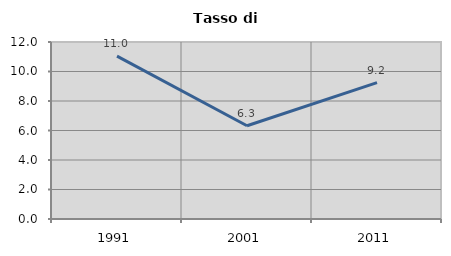
| Category | Tasso di disoccupazione   |
|---|---|
| 1991.0 | 11.04 |
| 2001.0 | 6.32 |
| 2011.0 | 9.243 |